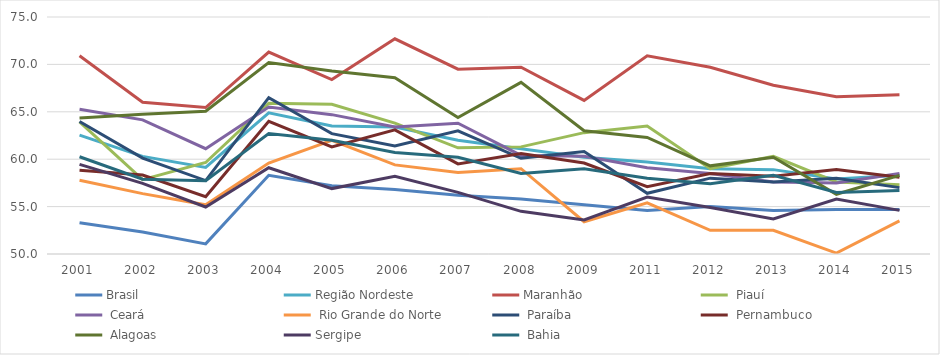
| Category | Brasil | Região Nordeste | Maranhão |  Piauí |  Ceará |  Rio Grande do Norte |  Paraíba |  Pernambuco |  Alagoas | Sergipe |  Bahia |
|---|---|---|---|---|---|---|---|---|---|---|---|
| 2001.0 | 53.3 | 62.532 | 70.914 | 63.937 | 65.261 | 57.78 | 63.984 | 58.847 | 64.356 | 59.459 | 60.257 |
| 2002.0 | 52.311 | 60.296 | 66.004 | 57.848 | 64.149 | 56.368 | 60.113 | 58.338 | 64.733 | 57.448 | 57.886 |
| 2003.0 | 51.07 | 59.124 | 65.447 | 59.655 | 61.108 | 55.186 | 57.749 | 56.042 | 65.066 | 54.96 | 57.724 |
| 2004.0 | 58.3 | 64.9 | 71.3 | 65.9 | 65.5 | 59.6 | 66.5 | 64 | 70.2 | 59.1 | 62.7 |
| 2005.0 | 57.2 | 63.5 | 68.4 | 65.8 | 64.7 | 62 | 62.7 | 61.3 | 69.3 | 56.9 | 62 |
| 2006.0 | 56.8 | 63.4 | 72.7 | 63.8 | 63.4 | 59.4 | 61.4 | 63.1 | 68.6 | 58.2 | 60.7 |
| 2007.0 | 56.2 | 62 | 69.5 | 61.2 | 63.8 | 58.6 | 63 | 59.5 | 64.4 | 56.5 | 60.2 |
| 2008.0 | 55.8 | 61.1 | 69.7 | 61.3 | 60.4 | 59 | 60.1 | 60.6 | 68.1 | 54.5 | 58.5 |
| 2009.0 | 55.2 | 60.2 | 66.2 | 62.8 | 60.3 | 53.4 | 60.8 | 59.6 | 63 | 53.6 | 59 |
| 2011.0 | 54.6 | 59.7 | 70.9 | 63.5 | 59.1 | 55.4 | 56.4 | 57.1 | 62.3 | 56 | 58 |
| 2012.0 | 55 | 59 | 69.7 | 59 | 58.5 | 52.5 | 58 | 58.5 | 59.3 | 54.9 | 57.4 |
| 2013.0 | 54.6 | 58.9 | 67.8 | 60.3 | 57.6 | 52.5 | 57.6 | 58.2 | 60.2 | 53.7 | 58.3 |
| 2014.0 | 54.7 | 57.9 | 66.6 | 57.6 | 57.5 | 50.1 | 58 | 58.9 | 56.3 | 55.8 | 56.5 |
| 2015.0 | 54.7 | 58.3 | 66.8 | 57.3 | 58.5 | 53.5 | 57 | 58.1 | 58.3 | 54.6 | 56.7 |